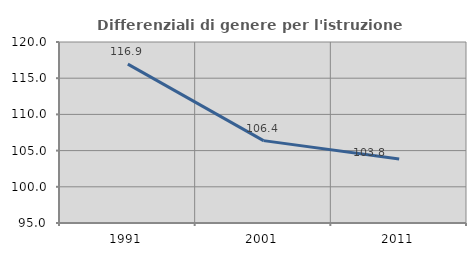
| Category | Differenziali di genere per l'istruzione superiore |
|---|---|
| 1991.0 | 116.944 |
| 2001.0 | 106.379 |
| 2011.0 | 103.835 |